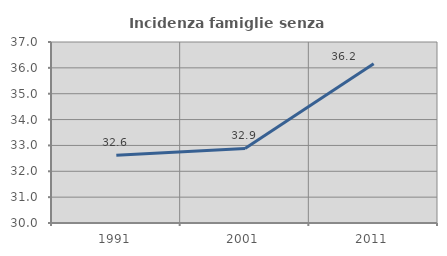
| Category | Incidenza famiglie senza nuclei |
|---|---|
| 1991.0 | 32.616 |
| 2001.0 | 32.881 |
| 2011.0 | 36.156 |